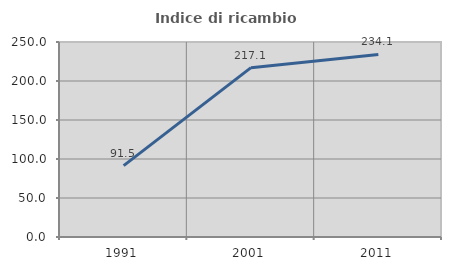
| Category | Indice di ricambio occupazionale  |
|---|---|
| 1991.0 | 91.489 |
| 2001.0 | 217.073 |
| 2011.0 | 234.058 |